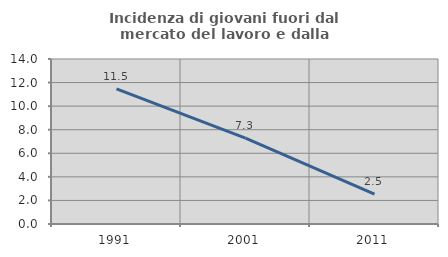
| Category | Incidenza di giovani fuori dal mercato del lavoro e dalla formazione  |
|---|---|
| 1991.0 | 11.467 |
| 2001.0 | 7.278 |
| 2011.0 | 2.542 |